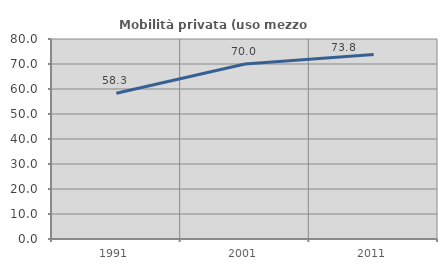
| Category | Mobilità privata (uso mezzo privato) |
|---|---|
| 1991.0 | 58.301 |
| 2001.0 | 70.005 |
| 2011.0 | 73.755 |